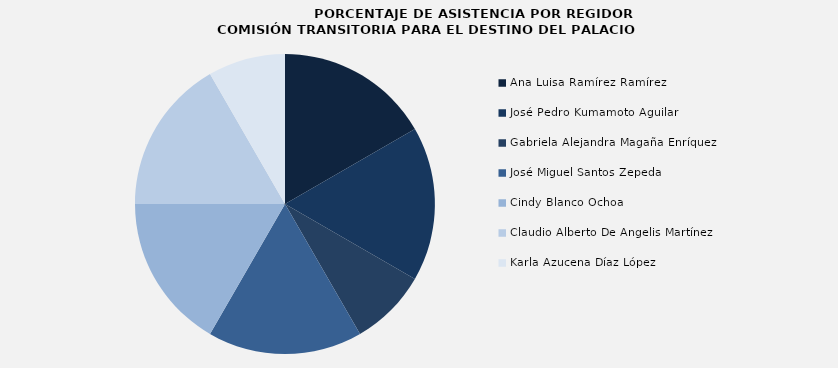
| Category | Ana Luisa Ramírez Ramírez |
|---|---|
| Ana Luisa Ramírez Ramírez | 100 |
| José Pedro Kumamoto Aguilar | 100 |
| Gabriela Alejandra Magaña Enríquez | 50 |
| José Miguel Santos Zepeda | 100 |
| Cindy Blanco Ochoa | 100 |
| Claudio Alberto De Angelis Martínez | 100 |
| Karla Azucena Díaz López | 50 |